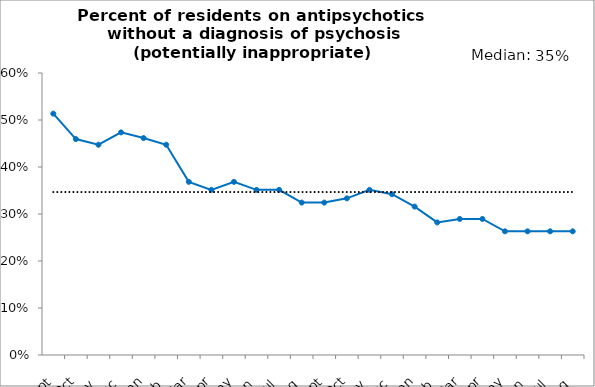
| Category | Potentially inappropriate | Median |
|---|---|---|
| 2015-09-01 | 0.514 | 0.347 |
| 2015-10-01 | 0.459 | 0.347 |
| 2015-11-01 | 0.447 | 0.347 |
| 2015-12-01 | 0.474 | 0.347 |
| 2016-01-01 | 0.462 | 0.347 |
| 2016-02-01 | 0.447 | 0.347 |
| 2016-03-01 | 0.368 | 0.347 |
| 2016-04-01 | 0.351 | 0.347 |
| 2016-05-01 | 0.368 | 0.347 |
| 2016-06-01 | 0.351 | 0.347 |
| 2016-07-01 | 0.351 | 0.347 |
| 2016-08-01 | 0.324 | 0.347 |
| 2016-09-01 | 0.324 | 0.347 |
| 2016-10-01 | 0.333 | 0.347 |
| 2016-11-01 | 0.351 | 0.347 |
| 2016-12-01 | 0.342 | 0.347 |
| 2017-01-01 | 0.316 | 0.347 |
| 2017-02-01 | 0.282 | 0.347 |
| 2017-03-01 | 0.289 | 0.347 |
| 2017-04-01 | 0.289 | 0.347 |
| 2017-05-01 | 0.263 | 0.347 |
| 2017-06-01 | 0.263 | 0.347 |
| 2017-07-01 | 0.263 | 0.347 |
| 2017-08-01 | 0.263 | 0.347 |